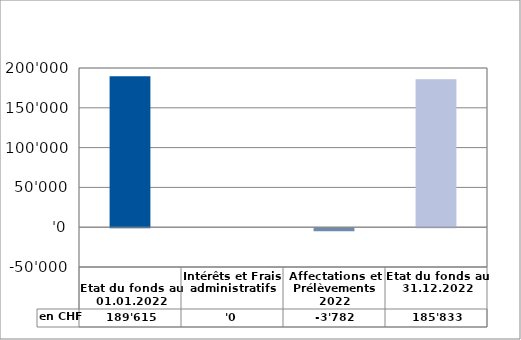
| Category | en CHF |
|---|---|
| 
Etat du fonds au 01.01.2022

 | 189615 |
| Intérêts et Frais administratifs | 0 |
| Affectations et Prélèvements 2022 | -3782 |
| Etat du fonds au 31.12.2022 | 185833 |